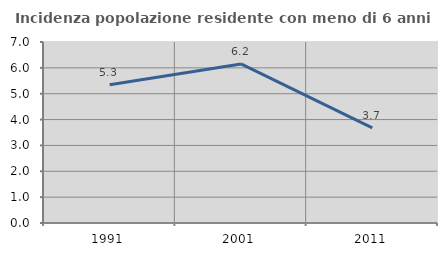
| Category | Incidenza popolazione residente con meno di 6 anni |
|---|---|
| 1991.0 | 5.347 |
| 2001.0 | 6.151 |
| 2011.0 | 3.677 |